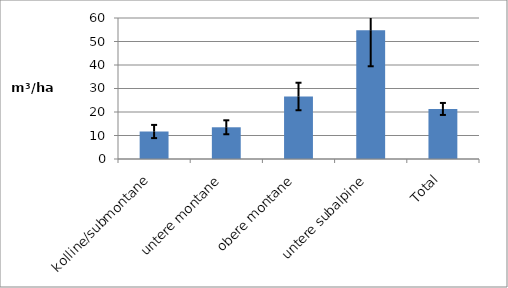
| Category | Series 0 |
|---|---|
| kolline/submontane | 11.7 |
| untere montane | 13.5 |
| obere montane | 26.6 |
| untere subalpine | 54.8 |
| Total | 21.3 |